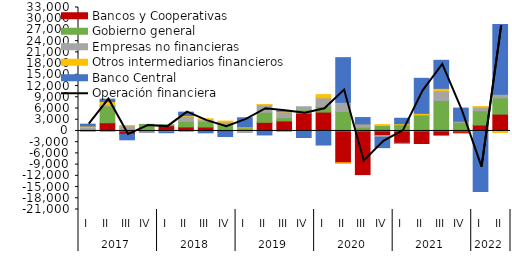
| Category | Bancos y Cooperativas | Gobierno general | Empresas no financieras | Otros intermediarios financieros | Banco Central |
|---|---|---|---|---|---|
| 0 | 176.525 | 291.94 | 552.774 | 291.22 | 500.031 |
| 1 | 2191.03 | 4434.382 | 396.373 | 816.537 | 657.32 |
| 2 | -866.634 | 335.819 | 1034.76 | 24.217 | -1500.259 |
| 3 | 269.332 | 1484.954 | -199.227 | -72.562 | -26.614 |
| 4 | 1397.801 | 235.632 | -83.56 | -138.002 | -252.82 |
| 5 | 1077.762 | 1504.673 | 1370.624 | 199.386 | 872.22 |
| 6 | 1052.846 | 1509.857 | 448.531 | 245.395 | -495.87 |
| 7 | -306.499 | 1625.849 | 723.919 | 265.815 | -1185.782 |
| 8 | -21.106 | 828.073 | -393.541 | 266.245 | 2429.827 |
| 9 | 2308.815 | 2686.164 | 1961.172 | 72.751 | -1071.366 |
| 10 | 2677.373 | 853.875 | 1575.736 | 151.298 | 142.172 |
| 11 | 4750.727 | 906.93 | 807.522 | -129.803 | -1619.017 |
| 12 | 5043.143 | 1503.25 | 2317.3 | 838.449 | -3766.184 |
| 13 | -8509.202 | 5214.809 | 2444.68 | -146.211 | 11929.007 |
| 14 | -11666.148 | 962.307 | 874.724 | 15.857 | 1729.234 |
| 15 | -1230.751 | 1438.553 | -469.537 | 248.588 | -2759.208 |
| 16 | -3304.175 | 1676.968 | -3.57 | 260.543 | 1455.217 |
| 17 | -3361.381 | 4160.828 | 223.412 | 328.941 | 9354.292 |
| 18 | -1109.911 | 8132.548 | 2582.179 | 664.925 | 7500.376 |
| 19 | -639.184 | 2294.924 | 307.156 | -42.044 | 3508.969 |
| 20 | 1588.558 | 3814.868 | 946.128 | 159.896 | -16162.137 |
| 21 | 4496.094 | 4344.827 | 969.92 | -404.659 | 18652.618 |